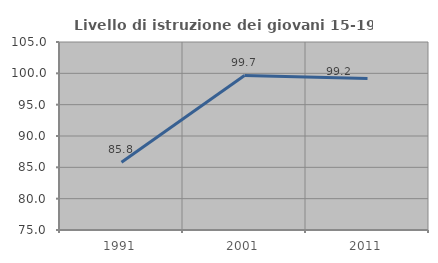
| Category | Livello di istruzione dei giovani 15-19 anni |
|---|---|
| 1991.0 | 85.795 |
| 2001.0 | 99.667 |
| 2011.0 | 99.16 |